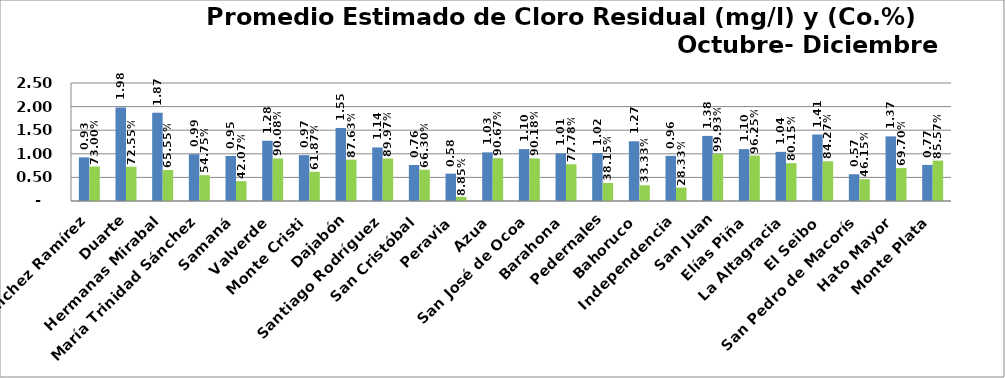
| Category | PROMEDIO TRIMESTRAL (mg/l) | PROMEDIO TRIMESTRAL (Co.%) |
|---|---|---|
| Sánchez Ramírez | 0.925 | 0.73 |
| Duarte | 1.983 | 0.725 |
| Hermanas Mirabal | 1.868 | 0.656 |
| María Trinidad Sánchez | 0.992 | 0.548 |
| Samaná | 0.954 | 0.421 |
| Valverde | 1.277 | 0.901 |
| Monte Cristi | 0.971 | 0.619 |
| Dajabón | 1.548 | 0.876 |
| Santiago Rodríguez | 1.135 | 0.9 |
| San Cristóbal | 0.763 | 0.663 |
| Peravia | 0.579 | 0.088 |
| Azua | 1.03 | 0.907 |
| San José de Ocoa | 1.1 | 0.902 |
| Barahona | 1.007 | 0.778 |
| Pedernales | 1.018 | 0.382 |
| Bahoruco | 1.265 | 0.333 |
| Independencia | 0.956 | 0.283 |
| San Juan | 1.379 | 0.999 |
| Elías Piña | 1.098 | 0.962 |
| La Altagracia | 1.041 | 0.802 |
| El Seibo | 1.408 | 0.843 |
| San Pedro de Macorís | 0.567 | 0.462 |
| Hato Mayor | 1.369 | 0.697 |
| Monte Plata | 0.765 | 0.856 |